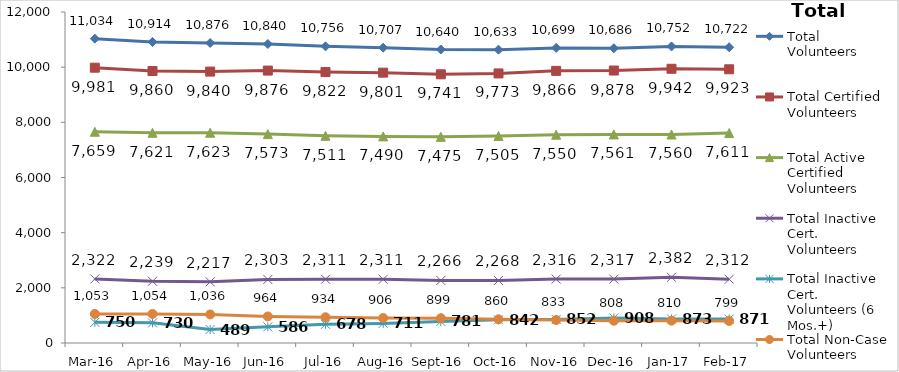
| Category | Total Volunteers | Total Certified Volunteers | Total Active Certified Volunteers | Total Inactive Cert. Volunteers | Total Inactive Cert. Volunteers (6 Mos.+) | Total Non-Case Volunteers |
|---|---|---|---|---|---|---|
| Mar-16 | 11034 | 9981 | 7659 | 2322 | 750 | 1053 |
| Apr-16 | 10914 | 9860 | 7621 | 2239 | 730 | 1054 |
| May-16 | 10876 | 9840 | 7623 | 2217 | 489 | 1036 |
| Jun-16 | 10840 | 9876 | 7573 | 2303 | 586 | 964 |
| Jul-16 | 10756 | 9822 | 7511 | 2311 | 678 | 934 |
| Aug-16 | 10707 | 9801 | 7490 | 2311 | 711 | 906 |
| Sep-16 | 10640 | 9741 | 7475 | 2266 | 781 | 899 |
| Oct-16 | 10633 | 9773 | 7505 | 2268 | 842 | 860 |
| Nov-16 | 10699 | 9866 | 7550 | 2316 | 852 | 833 |
| Dec-16 | 10686 | 9878 | 7561 | 2317 | 908 | 808 |
| Jan-17 | 10752 | 9942 | 7560 | 2382 | 873 | 810 |
| Feb-17 | 10722 | 9923 | 7611 | 2312 | 871 | 799 |